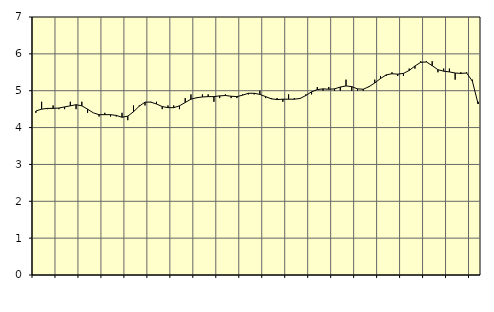
| Category | Piggar | Personliga och kulturella tjänster, SNI 90-98 |
|---|---|---|
| nan | 4.4 | 4.45 |
| 1.0 | 4.7 | 4.5 |
| 1.0 | 4.5 | 4.52 |
| 1.0 | 4.6 | 4.52 |
| nan | 4.5 | 4.53 |
| 2.0 | 4.5 | 4.56 |
| 2.0 | 4.7 | 4.59 |
| 2.0 | 4.5 | 4.62 |
| nan | 4.7 | 4.59 |
| 3.0 | 4.4 | 4.5 |
| 3.0 | 4.4 | 4.4 |
| 3.0 | 4.3 | 4.35 |
| nan | 4.4 | 4.35 |
| 4.0 | 4.3 | 4.35 |
| 4.0 | 4.3 | 4.33 |
| 4.0 | 4.4 | 4.28 |
| nan | 4.2 | 4.31 |
| 5.0 | 4.6 | 4.43 |
| 5.0 | 4.6 | 4.58 |
| 5.0 | 4.6 | 4.69 |
| nan | 4.7 | 4.69 |
| 6.0 | 4.7 | 4.64 |
| 6.0 | 4.5 | 4.57 |
| 6.0 | 4.6 | 4.54 |
| nan | 4.6 | 4.54 |
| 7.0 | 4.5 | 4.59 |
| 7.0 | 4.8 | 4.68 |
| 7.0 | 4.9 | 4.77 |
| nan | 4.8 | 4.81 |
| 8.0 | 4.9 | 4.83 |
| 8.0 | 4.9 | 4.84 |
| 8.0 | 4.7 | 4.84 |
| nan | 4.8 | 4.86 |
| 9.0 | 4.9 | 4.87 |
| 9.0 | 4.8 | 4.85 |
| 9.0 | 4.8 | 4.84 |
| nan | 4.9 | 4.88 |
| 10.0 | 4.9 | 4.93 |
| 10.0 | 4.9 | 4.93 |
| 10.0 | 5 | 4.9 |
| nan | 4.8 | 4.84 |
| 11.0 | 4.8 | 4.78 |
| 11.0 | 4.8 | 4.76 |
| 11.0 | 4.7 | 4.77 |
| nan | 4.9 | 4.77 |
| 12.0 | 4.8 | 4.77 |
| 12.0 | 4.8 | 4.79 |
| 12.0 | 4.9 | 4.87 |
| nan | 4.9 | 4.97 |
| 13.0 | 5.1 | 5.03 |
| 13.0 | 5 | 5.05 |
| 13.0 | 5.1 | 5.04 |
| nan | 5 | 5.05 |
| 14.0 | 5 | 5.1 |
| 14.0 | 5.3 | 5.13 |
| 14.0 | 5 | 5.11 |
| nan | 5 | 5.05 |
| 15.0 | 5 | 5.04 |
| 15.0 | 5.1 | 5.11 |
| 15.0 | 5.3 | 5.21 |
| nan | 5.4 | 5.33 |
| 16.0 | 5.4 | 5.43 |
| 16.0 | 5.5 | 5.46 |
| 16.0 | 5.4 | 5.45 |
| nan | 5.4 | 5.47 |
| 17.0 | 5.6 | 5.55 |
| 17.0 | 5.6 | 5.67 |
| 17.0 | 5.8 | 5.77 |
| nan | 5.8 | 5.78 |
| 18.0 | 5.8 | 5.68 |
| 18.0 | 5.5 | 5.57 |
| 18.0 | 5.6 | 5.53 |
| nan | 5.6 | 5.51 |
| 19.0 | 5.3 | 5.48 |
| 19.0 | 5.5 | 5.47 |
| 19.0 | 5.5 | 5.48 |
| nan | 5.3 | 5.26 |
| 20.0 | 4.7 | 4.64 |